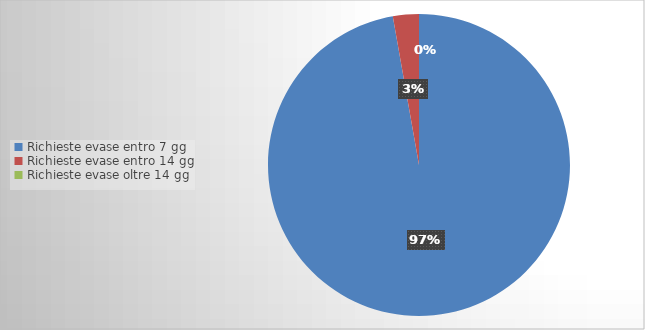
| Category | Series 0 |
|---|---|
| Richieste evase entro 7 gg | 35 |
| Richieste evase entro 14 gg | 1 |
| Richieste evase oltre 14 gg | 0 |